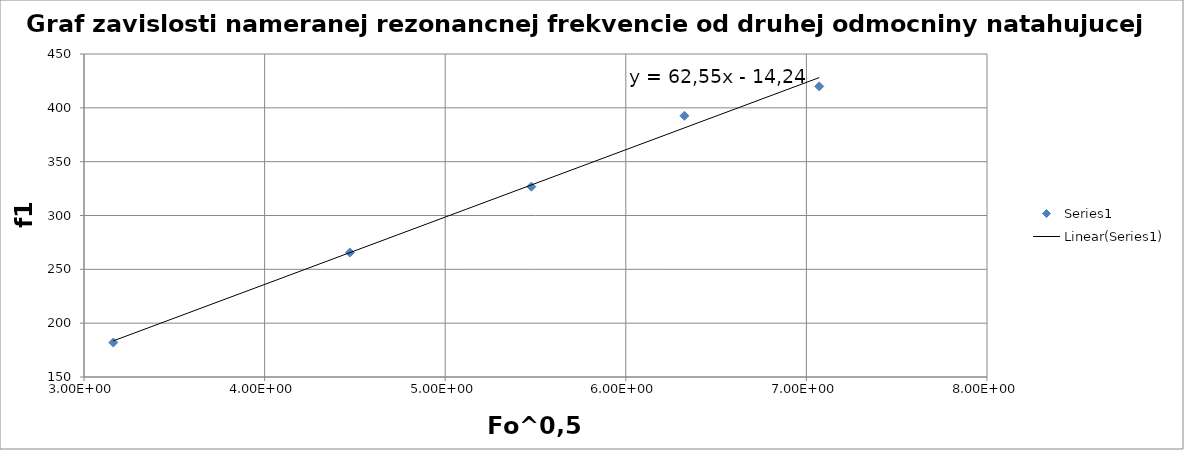
| Category | Series 0 |
|---|---|
| 3.1622776601683795 | 182 |
| 4.47213595499958 | 265.6 |
| 5.477225575051661 | 326.8 |
| 6.324555320336759 | 392.6 |
| 7.0710678118654755 | 419.9 |